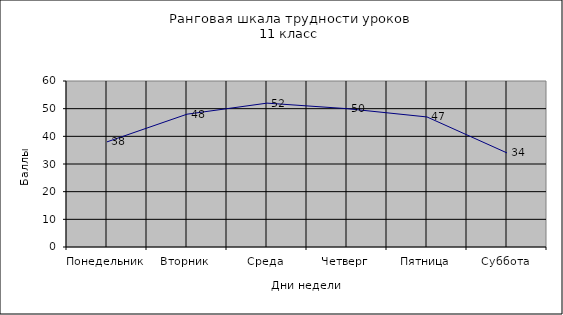
| Category | Series 0 |
|---|---|
| Понедельник | 38 |
| Вторник | 48 |
| Среда | 52 |
| Четверг | 50 |
| Пятница | 47 |
| Суббота | 34 |